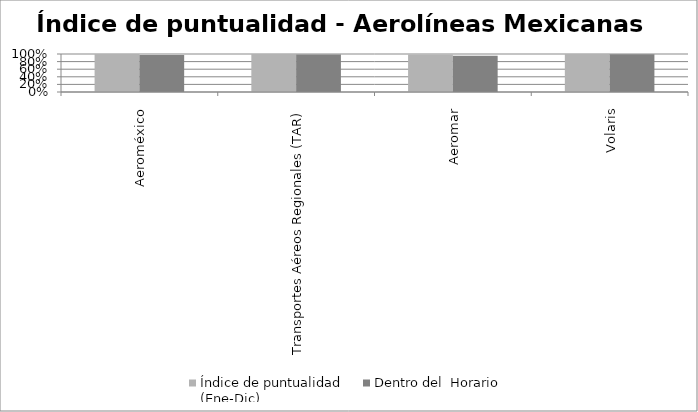
| Category | Índice de puntualidad
(Ene-Dic) | Dentro del  Horario |
|---|---|---|
| Aeroméxico | 1 | 0.972 |
| Transportes Aéreos Regionales (TAR) | 1 | 0.988 |
| Aeromar | 0.99 | 0.953 |
| Volaris | 0.998 | 0.995 |